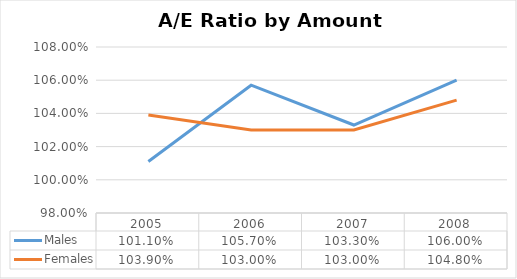
| Category | Males | Females |
|---|---|---|
| 2005.0 | 1.011 | 1.039 |
| 2006.0 | 1.057 | 1.03 |
| 2007.0 | 1.033 | 1.03 |
| 2008.0 | 1.06 | 1.048 |